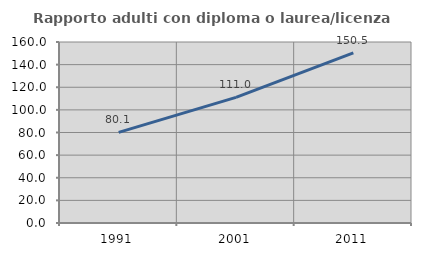
| Category | Rapporto adulti con diploma o laurea/licenza media  |
|---|---|
| 1991.0 | 80.059 |
| 2001.0 | 111.018 |
| 2011.0 | 150.456 |